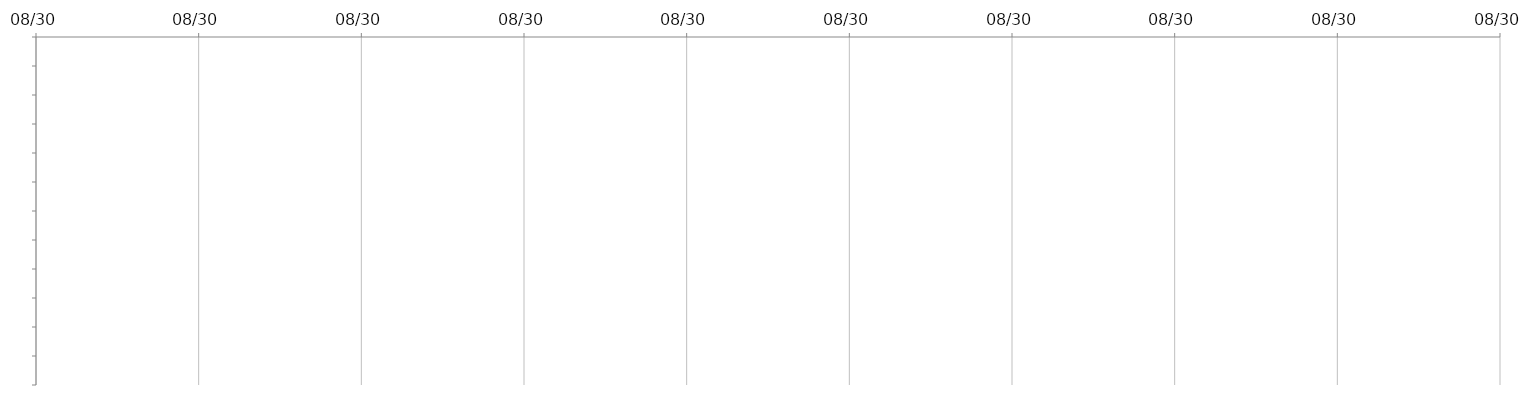
| Category | START | DAYS |
|---|---|---|
|  |  | 0 |
|  |  | 0 |
|  |  | 0 |
|  |  | 0 |
|  |  | 0 |
|  |  | 0 |
|  |  | 0 |
|  |  | 0 |
|  |  | 0 |
|  |  | 0 |
|  |  | 0 |
|  |  | 0 |